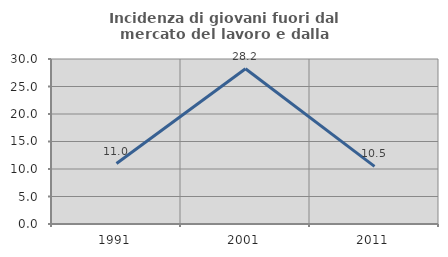
| Category | Incidenza di giovani fuori dal mercato del lavoro e dalla formazione  |
|---|---|
| 1991.0 | 10.989 |
| 2001.0 | 28.222 |
| 2011.0 | 10.468 |